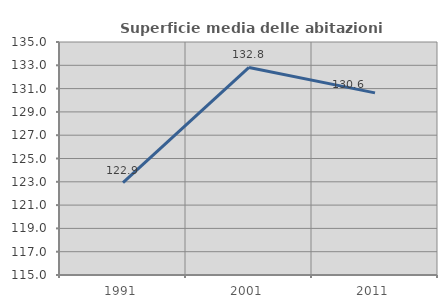
| Category | Superficie media delle abitazioni occupate |
|---|---|
| 1991.0 | 122.925 |
| 2001.0 | 132.817 |
| 2011.0 | 130.632 |